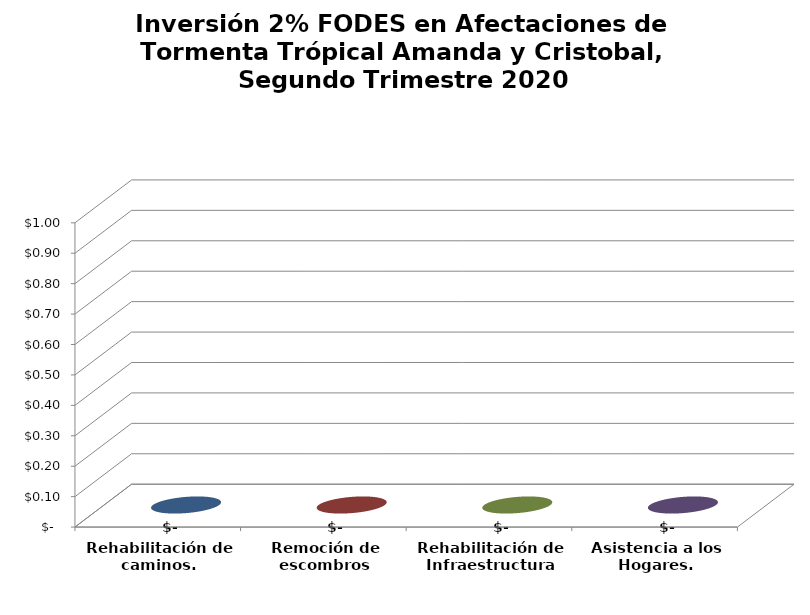
| Category | Series 0 |
|---|---|
| Rehabilitación de caminos. | 0 |
| Remoción de escombros | 0 |
| Rehabilitación de Infraestructura | 0 |
| Asistencia a los Hogares. | 0 |